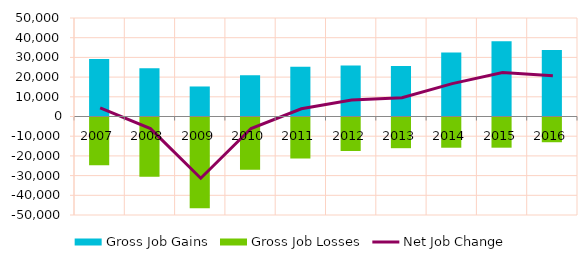
| Category | Gross Job Gains | Gross Job Losses |
|---|---|---|
| 2007.0 | 29128 | -24788 |
| 2008.0 | 24461 | -30585 |
| 2009.0 | 15241 | -46592 |
| 2010.0 | 20941 | -27051 |
| 2011.0 | 25233 | -21299 |
| 2012.0 | 25932 | -17517 |
| 2013.0 | 25618 | -16086 |
| 2014.0 | 32533 | -15850 |
| 2015.0 | 38158 | -15830 |
| 2016.0 | 33694 | -13062 |